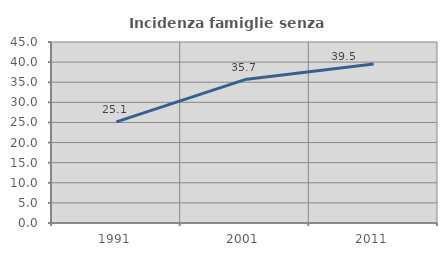
| Category | Incidenza famiglie senza nuclei |
|---|---|
| 1991.0 | 25.138 |
| 2001.0 | 35.657 |
| 2011.0 | 39.535 |